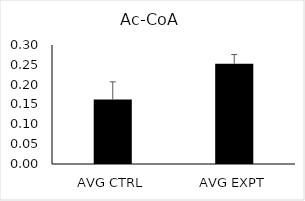
| Category | Series 0 |
|---|---|
| AVG CTRL | 0.163 |
| AVG EXPT | 0.253 |